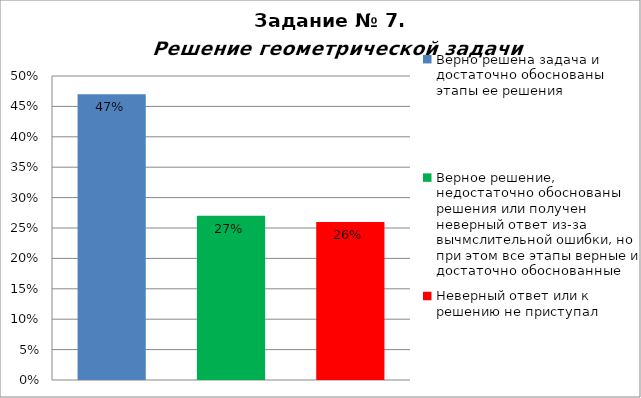
| Category | Решение геометрической задачи  |
|---|---|
| Верно решена задача и достаточно обоснованы этапы ее решения | 0.47 |
| Верное решение, недостаточно обоснованы решения или получен неверный ответ из-за вычмслительной ошибки, но при этом все этапы верные и достаточно обоснованные | 0.27 |
| Неверный ответ или к решению не приступал | 0.26 |